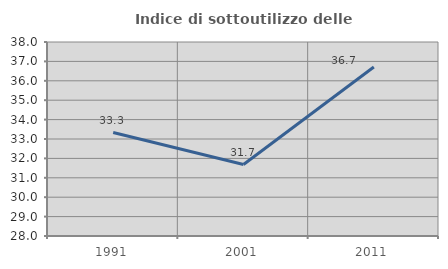
| Category | Indice di sottoutilizzo delle abitazioni  |
|---|---|
| 1991.0 | 33.333 |
| 2001.0 | 31.683 |
| 2011.0 | 36.709 |